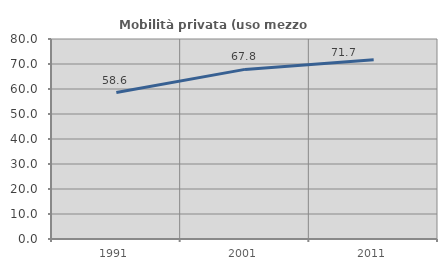
| Category | Mobilità privata (uso mezzo privato) |
|---|---|
| 1991.0 | 58.593 |
| 2001.0 | 67.841 |
| 2011.0 | 71.691 |